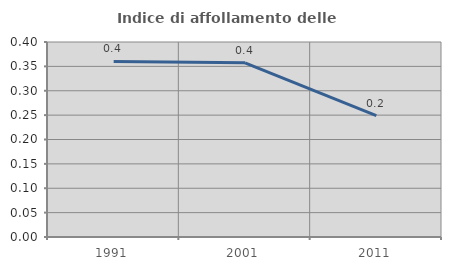
| Category | Indice di affollamento delle abitazioni  |
|---|---|
| 1991.0 | 0.36 |
| 2001.0 | 0.357 |
| 2011.0 | 0.249 |